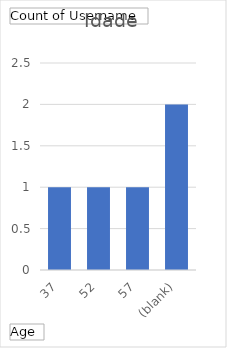
| Category | Total |
|---|---|
| 37 | 1 |
| 52 | 1 |
| 57 | 1 |
| (blank) | 2 |